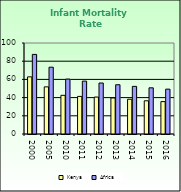
| Category | Kenya | Africa |
|---|---|---|
| 2000.0 | 62.8 | 87.462 |
| 2005.0 | 51.8 | 73.418 |
| 2010.0 | 42.5 | 60.345 |
| 2011.0 | 41.3 | 58.107 |
| 2012.0 | 40.6 | 56.032 |
| 2013.0 | 39.6 | 54.131 |
| 2014.0 | 38.2 | 52.336 |
| 2015.0 | 36.5 | 50.754 |
| 2016.0 | 35.6 | 49.283 |